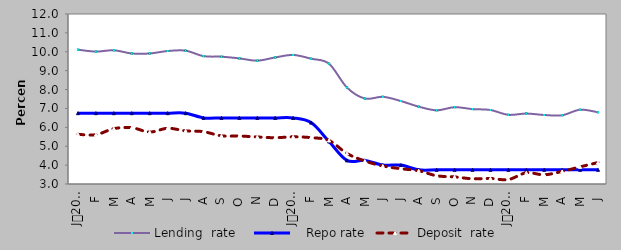
| Category | Lending  rate |    Repo rate | Deposit  rate |
|---|---|---|---|
| 0 | 10.11 | 6.75 | 5.63 |
| 1900-01-01 | 10.01 | 6.75 | 5.61 |
| 1900-01-02 | 10.08 | 6.75 | 5.93 |
| 1900-01-03 | 9.91 | 6.75 | 5.98 |
| 1900-01-04 | 9.91 | 6.75 | 5.75 |
| 1900-01-05 | 10.04 | 6.75 | 5.95 |
| 1900-01-06 | 10.06 | 6.75 | 5.813 |
| 1900-01-07 | 9.77 | 6.5 | 5.77 |
| 1900-01-08 | 9.74 | 6.5 | 5.55 |
| 1900-01-09 | 9.65 | 6.5 | 5.54 |
| 1900-01-10 | 9.53 | 6.5 | 5.49 |
| 1900-01-11 | 9.7 | 6.5 | 5.45 |
| 1900-01-12 | 9.833 | 6.5 | 5.497 |
| 1900-01-13 | 9.634 | 6.25 | 5.454 |
| 1900-01-14 | 9.369 | 5.25 | 5.304 |
| 1900-01-15 | 8.106 | 4.25 | 4.617 |
| 1900-01-16 | 7.526 | 4.25 | 4.216 |
| 1900-01-17 | 7.616 | 4 | 3.953 |
| 1900-01-18 | 7.394 | 4 | 3.809 |
| 1900-01-19 | 7.095 | 3.75 | 3.699 |
| 1900-01-20 | 6.902 | 3.75 | 3.437 |
| 1900-01-21 | 7.067 | 3.75 | 3.374 |
| 1900-01-22 | 6.965 | 3.75 | 3.276 |
| 1900-01-23 | 6.917 | 3.75 | 3.292 |
| 1900-01-24 | 6.663 | 3.75 | 3.236 |
| 1900-01-25 | 6.731 | 3.75 | 3.592 |
| 1900-01-26 | 6.653 | 3.75 | 3.488 |
| 1900-01-27 | 6.64 | 3.75 | 3.667 |
| 1900-01-28 | 6.933 | 3.75 | 3.907 |
| 1900-01-29 | 6.798 | 3.75 | 4.137 |